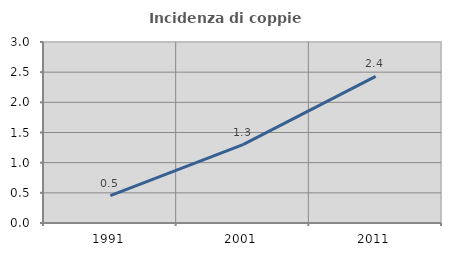
| Category | Incidenza di coppie miste |
|---|---|
| 1991.0 | 0.453 |
| 2001.0 | 1.3 |
| 2011.0 | 2.429 |